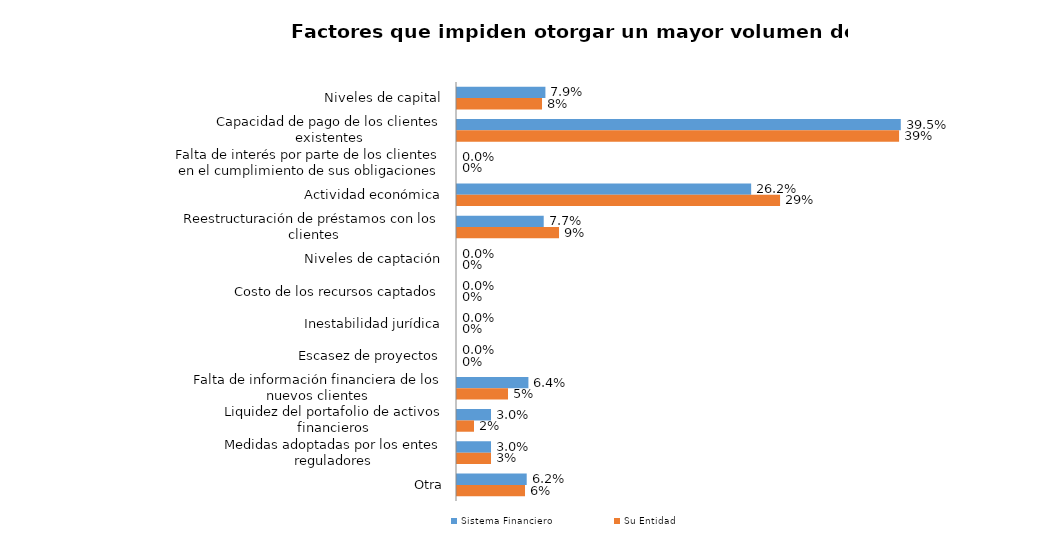
| Category | Sistema Financiero | Su Entidad |
|---|---|---|
| Niveles de capital | 0.079 | 0.076 |
| Capacidad de pago de los clientes existentes | 0.395 | 0.394 |
| Falta de interés por parte de los clientes en el cumplimiento de sus obligaciones | 0 | 0 |
| Actividad económica | 0.262 | 0.288 |
| Reestructuración de préstamos con los clientes | 0.077 | 0.091 |
| Niveles de captación | 0 | 0 |
| Costo de los recursos captados | 0 | 0 |
| Inestabilidad jurídica | 0 | 0 |
| Escasez de proyectos | 0 | 0 |
| Falta de información financiera de los nuevos clientes | 0.064 | 0.045 |
| Liquidez del portafolio de activos financieros | 0.03 | 0.015 |
| Medidas adoptadas por los entes reguladores | 0.03 | 0.03 |
| Otra | 0.062 | 0.061 |